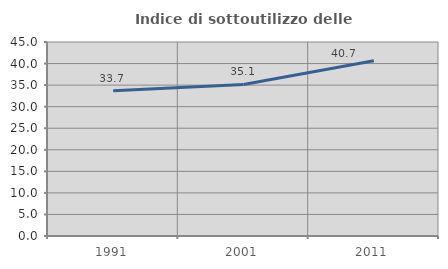
| Category | Indice di sottoutilizzo delle abitazioni  |
|---|---|
| 1991.0 | 33.69 |
| 2001.0 | 35.143 |
| 2011.0 | 40.673 |